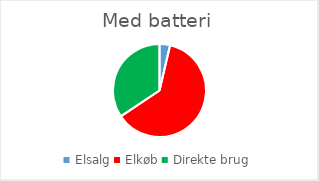
| Category | Series 0 |
|---|---|
| Elsalg | 303.296 |
| Elkøb | 5146.093 |
| Direkte brug | 2853.907 |